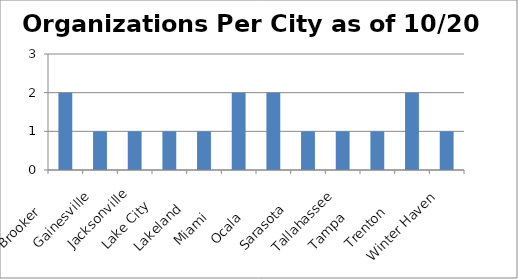
| Category | Organizations Per City as of 10/20 |
|---|---|
|  Brooker        | 2 |
|  Gainesville    | 1 |
|  Jacksonville   | 1 |
|  Lake City      | 1 |
|  Lakeland       | 1 |
|  Miami          | 2 |
|  Ocala          | 2 |
|  Sarasota       | 1 |
|  Tallahassee    | 1 |
|  Tampa          | 1 |
|  Trenton        | 2 |
|  Winter Haven   | 1 |